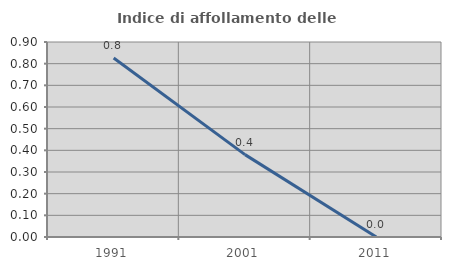
| Category | Indice di affollamento delle abitazioni  |
|---|---|
| 1991.0 | 0.826 |
| 2001.0 | 0.38 |
| 2011.0 | 0 |